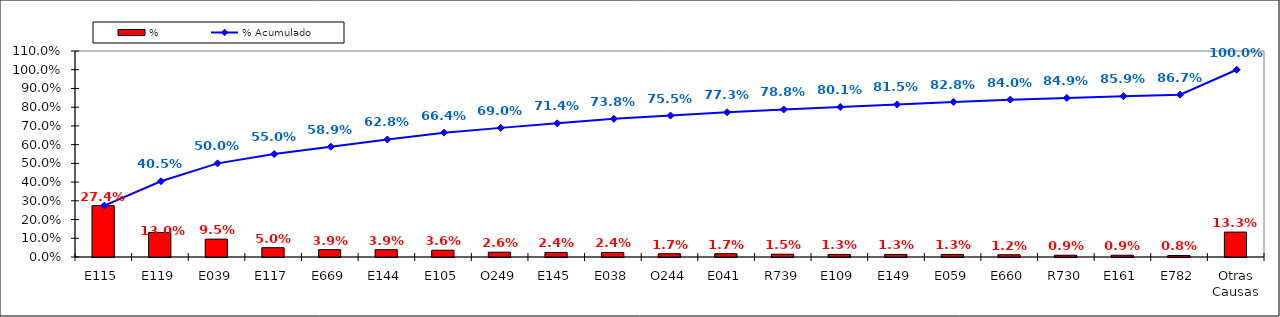
| Category | % |
|---|---|
| E115 | 0.274 |
| E119 | 0.13 |
| E039 | 0.095 |
| E117 | 0.05 |
| E669 | 0.039 |
| E144 | 0.039 |
| E105 | 0.036 |
| O249 | 0.026 |
| E145 | 0.024 |
| E038 | 0.024 |
| O244 | 0.017 |
| E041 | 0.017 |
| R739 | 0.015 |
| E109 | 0.013 |
| E149 | 0.013 |
| E059 | 0.013 |
| E660 | 0.012 |
| R730 | 0.009 |
| E161 | 0.009 |
| E782 | 0.008 |
| Otras Causas | 0.133 |